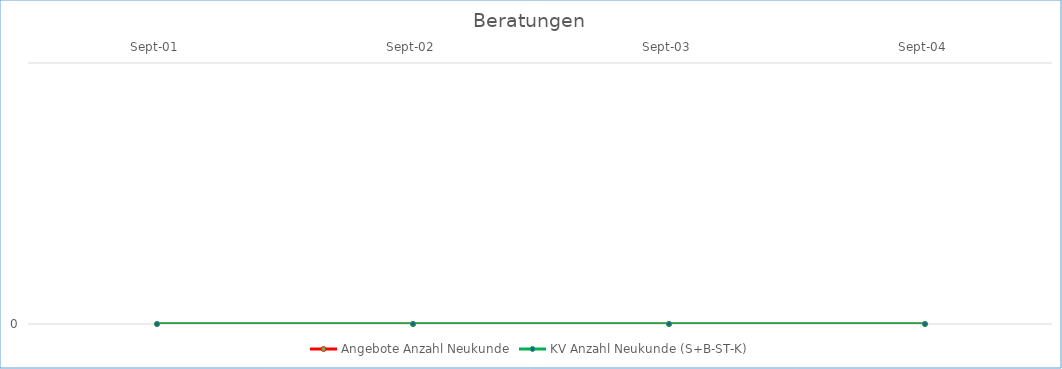
| Category | Angebote Anzahl Neukunde | KV Anzahl Neukunde (S+B-ST-K) |
|---|---|---|
| 2001-09-01 | 0 | 0 |
| 2002-09-01 | 0 | 0 |
| 2003-09-01 | 0 | 0 |
| 2004-09-01 | 0 | 0 |